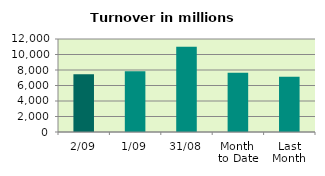
| Category | Series 0 |
|---|---|
| 2/09 | 7446.265 |
| 1/09 | 7842.199 |
| 31/08 | 10984.016 |
| Month 
to Date | 7644.232 |
| Last
Month | 7128.729 |